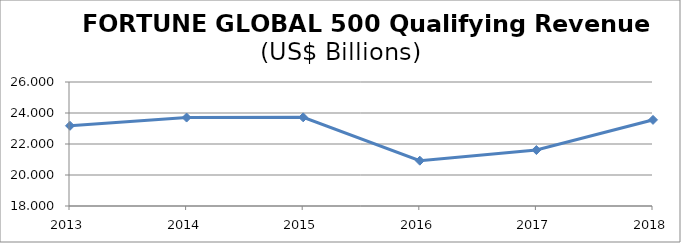
| Category | Series 0 |
|---|---|
| 2013.0 | 23.175 |
| 2014.0 | 23.706 |
| 2015.0 | 23.72 |
| 2016.0 | 20.923 |
| 2017.0 | 21.609 |
| 2018.0 | 23.556 |